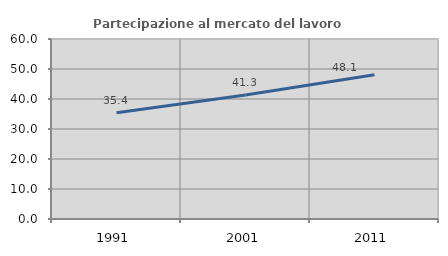
| Category | Partecipazione al mercato del lavoro  femminile |
|---|---|
| 1991.0 | 35.4 |
| 2001.0 | 41.314 |
| 2011.0 | 48.097 |